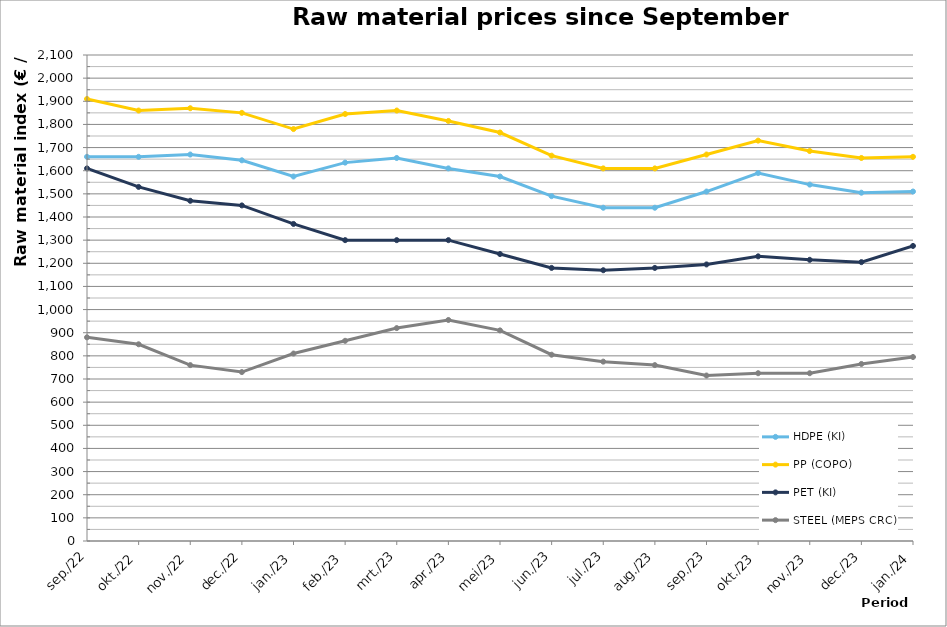
| Category | HDPE (KI) | PP (COPO) | PET (KI) | STEEL (MEPS CRC) |
|---|---|---|---|---|
| 2022-09-01 | 1660 | 1910 | 1610 | 880 |
| 2022-10-01 | 1660 | 1860 | 1530 | 850 |
| 2022-11-01 | 1670 | 1870 | 1470 | 760 |
| 2022-12-01 | 1645 | 1850 | 1450 | 730 |
| 2023-01-01 | 1575 | 1780 | 1370 | 810 |
| 2023-02-01 | 1635 | 1845 | 1300 | 865 |
| 2023-03-01 | 1655 | 1860 | 1300 | 920 |
| 2023-04-01 | 1610 | 1815 | 1300 | 955 |
| 2023-05-01 | 1575 | 1765 | 1240 | 910 |
| 2023-06-01 | 1490 | 1665 | 1180 | 805 |
| 2023-07-01 | 1440 | 1610 | 1170 | 775 |
| 2023-08-01 | 1440 | 1610 | 1180 | 760 |
| 2023-09-01 | 1510 | 1670 | 1195 | 715 |
| 2023-10-01 | 1590 | 1730 | 1230 | 725 |
| 2023-11-01 | 1540 | 1685 | 1215 | 725 |
| 2023-12-01 | 1505 | 1655 | 1205 | 765 |
| 2024-01-01 | 1510 | 1660 | 1275 | 795 |